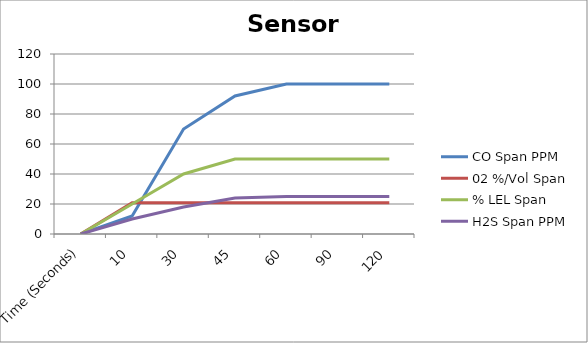
| Category | CO Span PPM | 02 %/Vol Span | % LEL Span | H2S Span PPM |
|---|---|---|---|---|
| Time (Seconds) | 0 | 0 | 0 | 0 |
| 10 | 12 | 20.9 | 20 | 10 |
| 30 | 70 | 20.9 | 40 | 18 |
| 45 | 92 | 20.9 | 50 | 24 |
| 60 | 100 | 20.9 | 50 | 25 |
| 90 | 100 | 20.9 | 50 | 25 |
| 120 | 100 | 20.9 | 50 | 25 |